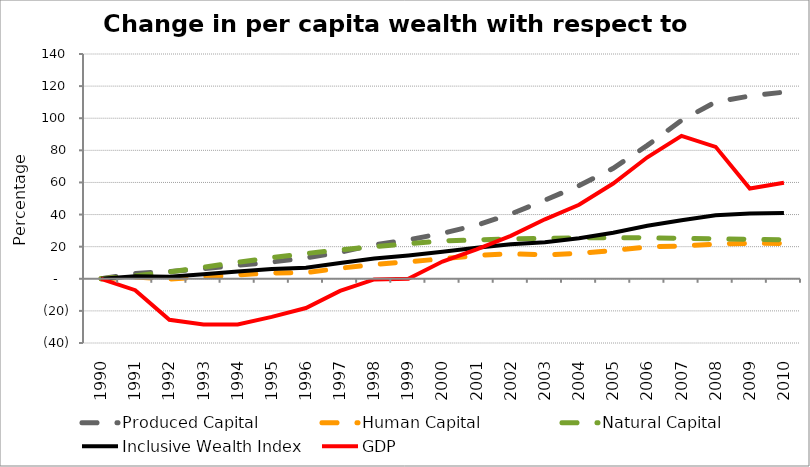
| Category | Produced Capital  | Human Capital | Natural Capital | Inclusive Wealth Index | GDP |
|---|---|---|---|---|---|
| 1990.0 | 0 | 0 | 0 | 0 | 0 |
| 1991.0 | 3.348 | 1.08 | 1.795 | 1.609 | -7.095 |
| 1992.0 | 4.484 | -0.155 | 4.267 | 1.257 | -25.577 |
| 1993.0 | 6.253 | 1.171 | 7.219 | 2.851 | -28.43 |
| 1994.0 | 8.362 | 2.46 | 10.296 | 4.502 | -28.405 |
| 1995.0 | 10.428 | 3.619 | 13.185 | 6.033 | -23.755 |
| 1996.0 | 12.98 | 3.765 | 15.746 | 6.925 | -18.226 |
| 1997.0 | 16.492 | 6.579 | 18.009 | 9.816 | -7.549 |
| 1998.0 | 21.135 | 8.936 | 20 | 12.586 | -0.427 |
| 1999.0 | 24.218 | 10.605 | 21.822 | 14.552 | 0.026 |
| 2000.0 | 28.343 | 12.441 | 23.561 | 16.831 | 10.742 |
| 2001.0 | 33.346 | 14.462 | 24.238 | 19.295 | 18.383 |
| 2002.0 | 40.349 | 15.67 | 24.763 | 21.576 | 26.724 |
| 2003.0 | 48.964 | 14.783 | 25.154 | 22.716 | 37.038 |
| 2004.0 | 57.996 | 15.898 | 25.437 | 25.308 | 46.109 |
| 2005.0 | 68.851 | 17.578 | 25.637 | 28.644 | 59.351 |
| 2006.0 | 83.096 | 19.821 | 25.452 | 32.997 | 75.679 |
| 2007.0 | 98.663 | 20.457 | 25.205 | 36.497 | 89.005 |
| 2008.0 | 110.145 | 21.582 | 24.917 | 39.519 | 82.166 |
| 2009.0 | 113.808 | 22.127 | 24.609 | 40.588 | 56.253 |
| 2010.0 | 116.253 | 21.971 | 24.298 | 40.93 | 59.848 |